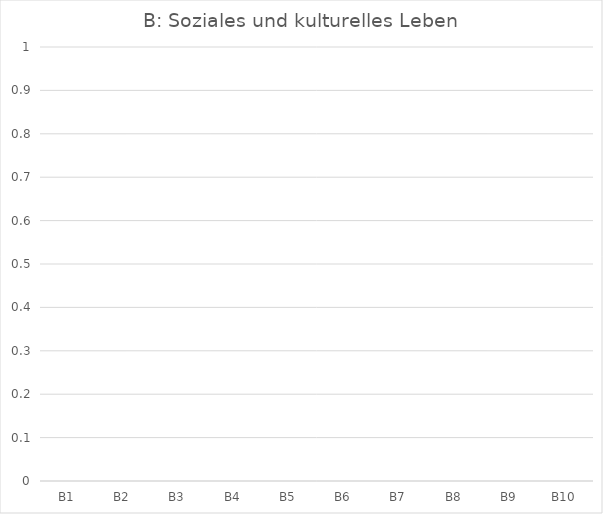
| Category | 0 |
|---|---|
| B1 | 0 |
| B2 | 0 |
| B3 | 0 |
| B4 | 0 |
| B5 | 0 |
| B6 | 0 |
| B7 | 0 |
| B8 | 0 |
| B9 | 0 |
| B10 | 0 |